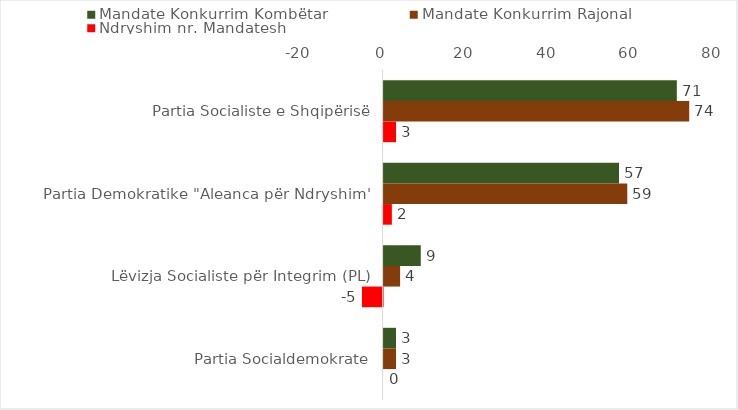
| Category | Mandate Konkurrim Kombëtar | Mandate Konkurrim Rajonal | Ndryshim nr. Mandatesh |
|---|---|---|---|
| Partia Socialiste e Shqipërisë | 71 | 74 | 3 |
| Partia Demokratike "Aleanca për Ndryshim" | 57 | 59 | 2 |
| Lëvizja Socialiste për Integrim (PL) | 9 | 4 | -5 |
| Partia Socialdemokrate | 3 | 3 | 0 |